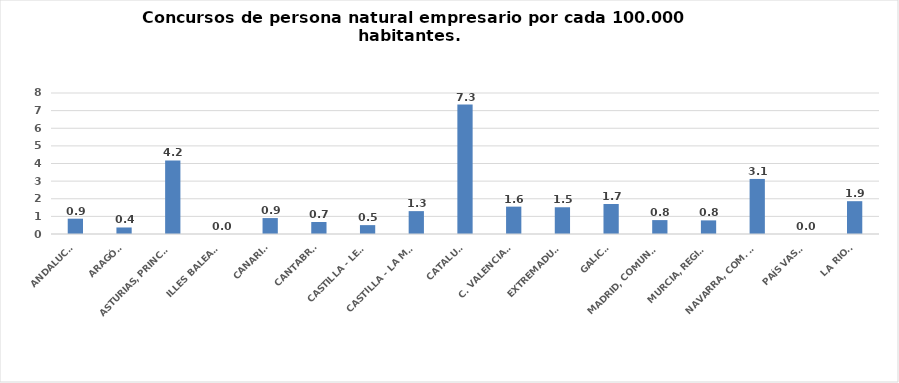
| Category | Series 0 |
|---|---|
| ANDALUCÍA | 0.869 |
| ARAGÓN | 0.371 |
| ASTURIAS, PRINCIPADO | 4.172 |
| ILLES BALEARS | 0 |
| CANARIAS | 0.904 |
| CANTABRIA | 0.68 |
| CASTILLA - LEÓN | 0.504 |
| CASTILLA - LA MANCHA | 1.298 |
| CATALUÑA | 7.343 |
| C. VALENCIANA | 1.552 |
| EXTREMADURA | 1.518 |
| GALICIA | 1.704 |
| MADRID, COMUNIDAD | 0.788 |
| MURCIA, REGIÓN | 0.773 |
| NAVARRA, COM. FORAL | 3.124 |
| PAÍS VASCO | 0 |
| LA RIOJA | 1.862 |